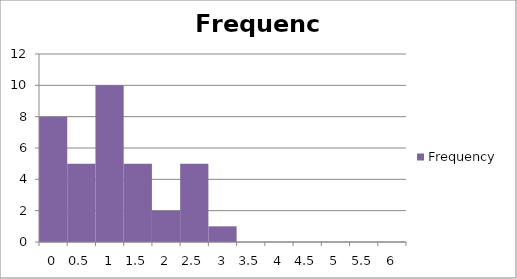
| Category | Frequency |
|---|---|
| 0 | 8 |
| 1 | 5 |
| 2 | 10 |
| 3 | 5 |
| 4 | 2 |
| 5 | 5 |
| 6 | 1 |
| 7 | 0 |
| 8 | 0 |
| 9 | 0 |
| 10 | 0 |
| 11 | 0 |
| 12 | 0 |